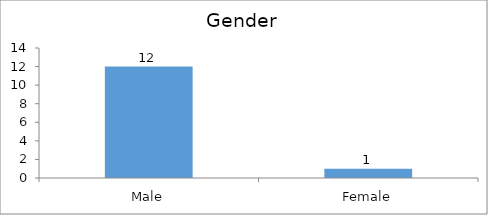
| Category | Gender |
|---|---|
| Male | 12 |
| Female | 1 |